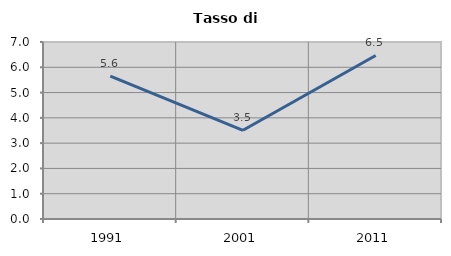
| Category | Tasso di disoccupazione   |
|---|---|
| 1991.0 | 5.649 |
| 2001.0 | 3.508 |
| 2011.0 | 6.468 |